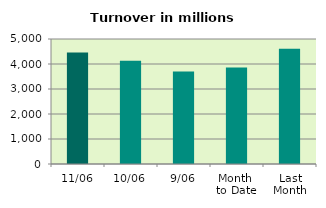
| Category | Series 0 |
|---|---|
| 11/06 | 4460.329 |
| 10/06 | 4133.832 |
| 9/06 | 3703.391 |
| Month 
to Date | 3862.185 |
| Last
Month | 4609.327 |